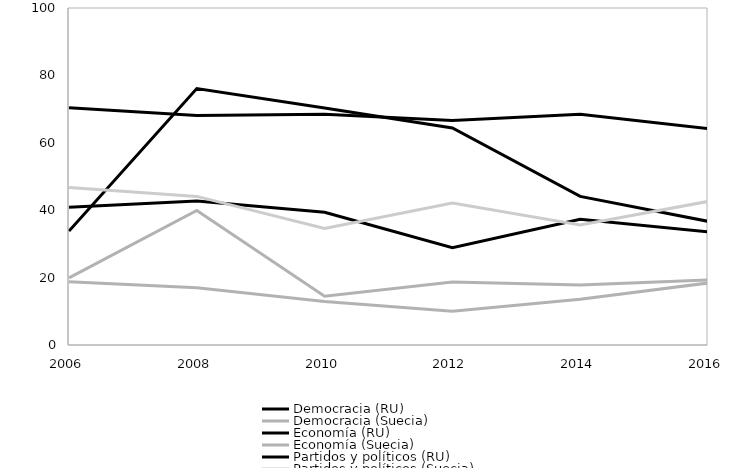
| Category | Democracia (RU) | Democracia (Suecia) | Economía (RU) | Economía (Suecia) | Partidos y políticos (RU) | Partidos y políticos (Suecia) |
|---|---|---|---|---|---|---|
| 2006.0 | 40.9 | 18.8 | 33.8 | 19.9 | 70.4 | 46.7 |
| 2008.0 | 42.7 | 17 | 76.1 | 39.9 | 68.1 | 44.1 |
| 2010.0 | 39.4 | 12.9 | 70.3 | 14.5 | 68.5 | 34.6 |
| 2012.0 | 28.9 | 10 | 64.4 | 18.7 | 66.6 | 42.1 |
| 2014.0 | 37.3 | 13.6 | 44.1 | 17.8 | 68.5 | 35.6 |
| 2016.0 | 33.6 | 18.4 | 36.7 | 19.3 | 64.2 | 42.6 |